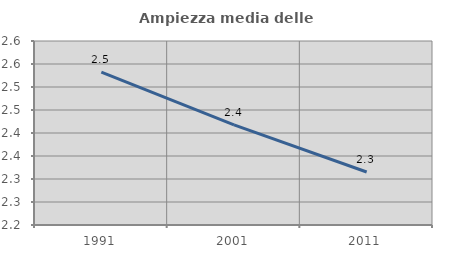
| Category | Ampiezza media delle famiglie |
|---|---|
| 1991.0 | 2.532 |
| 2001.0 | 2.418 |
| 2011.0 | 2.315 |